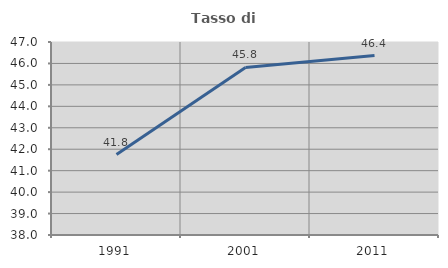
| Category | Tasso di occupazione   |
|---|---|
| 1991.0 | 41.752 |
| 2001.0 | 45.811 |
| 2011.0 | 46.368 |